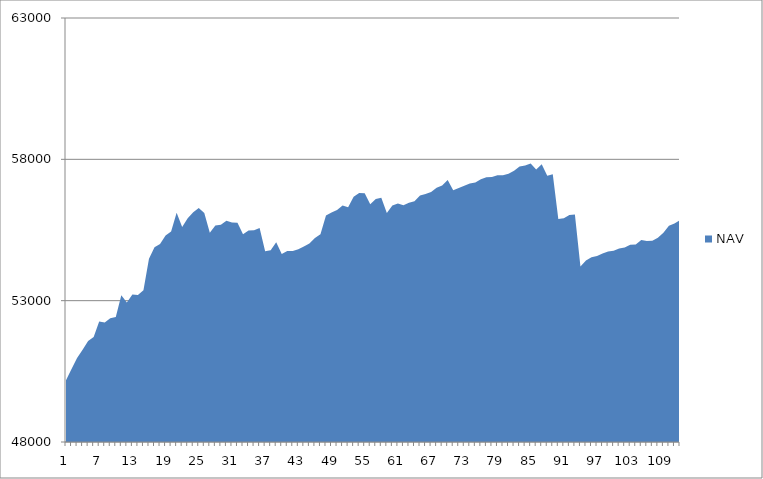
| Category | NAV |
|---|---|
| 0 | 50185.185 |
| 1 | 50585.185 |
| 2 | 50973.977 |
| 3 | 51265.977 |
| 4 | 51576.741 |
| 5 | 51711.523 |
| 6 | 52262.893 |
| 7 | 52230.24 |
| 8 | 52381.556 |
| 9 | 52425.915 |
| 10 | 53192.581 |
| 11 | 52939.146 |
| 12 | 53220.069 |
| 13 | 53197.341 |
| 14 | 53369.61 |
| 15 | 54480.721 |
| 16 | 54888.365 |
| 17 | 55001.902 |
| 18 | 55308.308 |
| 19 | 55448.308 |
| 20 | 56110.305 |
| 21 | 55610.305 |
| 22 | 55916.954 |
| 23 | 56129.798 |
| 24 | 56279.798 |
| 25 | 56105.301 |
| 26 | 55401.645 |
| 27 | 55657.201 |
| 28 | 55686.925 |
| 29 | 55823.001 |
| 30 | 55769.596 |
| 31 | 55759.375 |
| 32 | 55350.284 |
| 33 | 55480.284 |
| 34 | 55492.498 |
| 35 | 55570.42 |
| 36 | 54746.89 |
| 37 | 54783.7 |
| 38 | 55066.459 |
| 39 | 54651.074 |
| 40 | 54754.078 |
| 41 | 54760.213 |
| 42 | 54816.924 |
| 43 | 54917.296 |
| 44 | 55025.73 |
| 45 | 55220.535 |
| 46 | 55353.465 |
| 47 | 56009.309 |
| 48 | 56118.959 |
| 49 | 56205.212 |
| 50 | 56362.876 |
| 51 | 56307.394 |
| 52 | 56678.935 |
| 53 | 56813.264 |
| 54 | 56799.502 |
| 55 | 56409.112 |
| 56 | 56596.44 |
| 57 | 56640.493 |
| 58 | 56102.227 |
| 59 | 56370.449 |
| 60 | 56434.248 |
| 61 | 56376.841 |
| 62 | 56464.524 |
| 63 | 56518.022 |
| 64 | 56724.747 |
| 65 | 56770.361 |
| 66 | 56848.099 |
| 67 | 56992.896 |
| 68 | 57073.571 |
| 69 | 57266.481 |
| 70 | 56908.016 |
| 71 | 56984.939 |
| 72 | 57069.276 |
| 73 | 57147.627 |
| 74 | 57179.83 |
| 75 | 57291.17 |
| 76 | 57366.35 |
| 77 | 57371.599 |
| 78 | 57439.215 |
| 79 | 57440.895 |
| 80 | 57490.895 |
| 81 | 57593.679 |
| 82 | 57746.643 |
| 83 | 57785.413 |
| 84 | 57849.748 |
| 85 | 57639.346 |
| 86 | 57828.82 |
| 87 | 57417.055 |
| 88 | 57471.335 |
| 89 | 55888.376 |
| 90 | 55913.907 |
| 91 | 56031.989 |
| 92 | 56044.711 |
| 93 | 54210.631 |
| 94 | 54422.612 |
| 95 | 54536.647 |
| 96 | 54575.903 |
| 97 | 54670.229 |
| 98 | 54737.367 |
| 99 | 54762.386 |
| 100 | 54842.923 |
| 101 | 54881.385 |
| 102 | 54978.816 |
| 103 | 54991.283 |
| 104 | 55149.699 |
| 105 | 55109.498 |
| 106 | 55121.656 |
| 107 | 55227.569 |
| 108 | 55405.15 |
| 109 | 55650.183 |
| 110 | 55733.424 |
| 111 | 55846.244 |